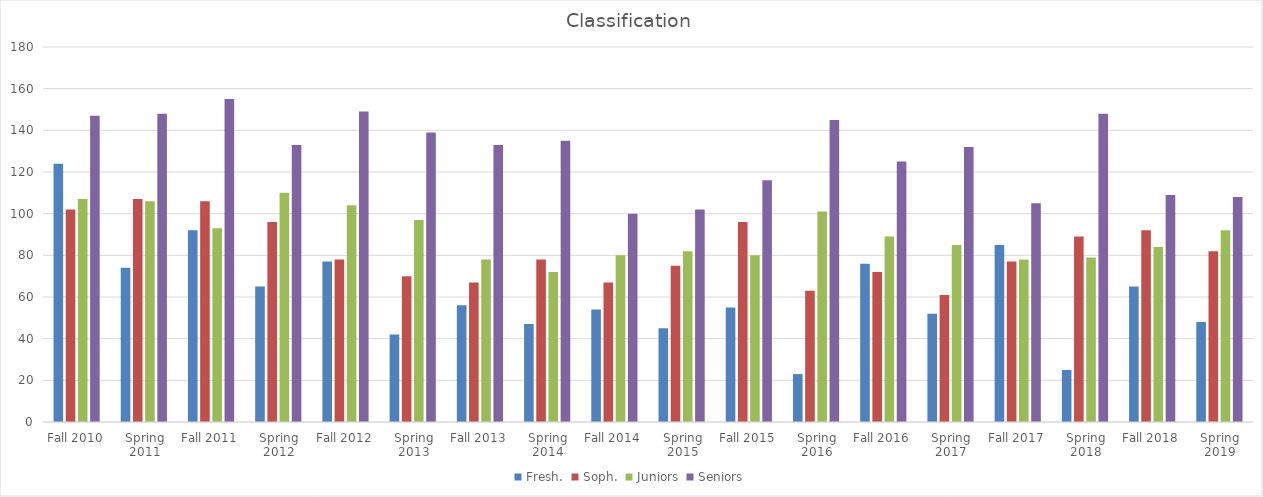
| Category | Fresh. | Soph. | Juniors | Seniors |
|---|---|---|---|---|
| Fall 2010 | 124 | 102 | 107 | 147 |
| Spring 2011 | 74 | 107 | 106 | 148 |
| Fall 2011 | 92 | 106 | 93 | 155 |
| Spring 2012 | 65 | 96 | 110 | 133 |
| Fall 2012 | 77 | 78 | 104 | 149 |
| Spring 2013 | 42 | 70 | 97 | 139 |
| Fall 2013 | 56 | 67 | 78 | 133 |
| Spring 2014 | 47 | 78 | 72 | 135 |
| Fall 2014 | 54 | 67 | 80 | 100 |
| Spring 2015 | 45 | 75 | 82 | 102 |
| Fall 2015 | 55 | 96 | 80 | 116 |
| Spring 2016 | 23 | 63 | 101 | 145 |
| Fall 2016 | 76 | 72 | 89 | 125 |
| Spring 2017 | 52 | 61 | 85 | 132 |
| Fall 2017 | 85 | 77 | 78 | 105 |
| Spring 2018 | 25 | 89 | 79 | 148 |
| Fall 2018 | 65 | 92 | 84 | 109 |
| Spring 2019 | 48 | 82 | 92 | 108 |